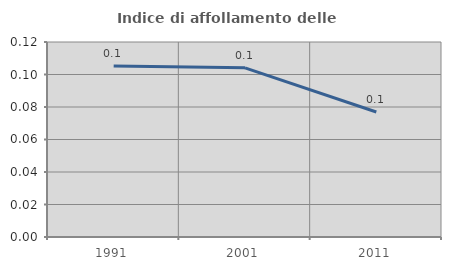
| Category | Indice di affollamento delle abitazioni  |
|---|---|
| 1991.0 | 0.105 |
| 2001.0 | 0.104 |
| 2011.0 | 0.077 |